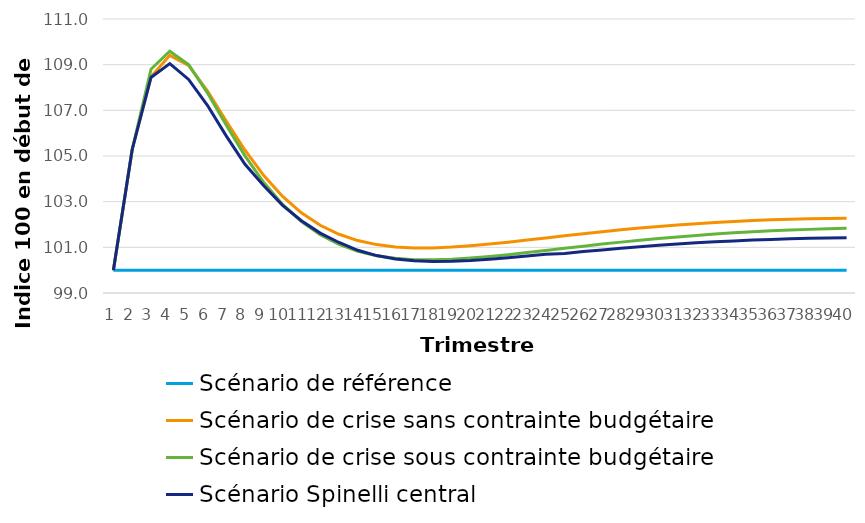
| Category | Scénario de référence | Scénario de crise sans contrainte budgétaire | Scénario de crise sous contrainte budgétaire | Scénario Spinelli central |
|---|---|---|---|---|
| 0 | 100 | 100 | 100 | 100 |
| 1 | 100 | 105.286 | 105.286 | 105.287 |
| 2 | 100 | 108.467 | 108.803 | 108.441 |
| 3 | 100 | 109.409 | 109.588 | 109.048 |
| 4 | 100 | 108.965 | 108.999 | 108.354 |
| 5 | 100 | 107.849 | 107.767 | 107.221 |
| 6 | 100 | 106.527 | 106.353 | 105.881 |
| 7 | 100 | 105.253 | 105.007 | 104.634 |
| 8 | 100 | 104.141 | 103.839 | 103.701 |
| 9 | 100 | 103.228 | 102.879 | 102.839 |
| 10 | 100 | 102.51 | 102.124 | 102.163 |
| 11 | 100 | 101.966 | 101.549 | 101.623 |
| 12 | 100 | 101.571 | 101.127 | 101.213 |
| 13 | 100 | 101.297 | 100.831 | 100.87 |
| 14 | 100 | 101.119 | 100.635 | 100.639 |
| 15 | 100 | 101.018 | 100.517 | 100.492 |
| 16 | 100 | 100.975 | 100.461 | 100.411 |
| 17 | 100 | 100.976 | 100.452 | 100.38 |
| 18 | 100 | 101.01 | 100.478 | 100.387 |
| 19 | 100 | 101.068 | 100.529 | 100.421 |
| 20 | 100 | 101.143 | 100.599 | 100.474 |
| 21 | 100 | 101.227 | 100.68 | 100.541 |
| 22 | 100 | 101.318 | 100.77 | 100.617 |
| 23 | 100 | 101.412 | 100.863 | 100.697 |
| 24 | 100 | 101.505 | 100.957 | 100.732 |
| 25 | 100 | 101.596 | 101.05 | 100.813 |
| 26 | 100 | 101.684 | 101.141 | 100.888 |
| 27 | 100 | 101.766 | 101.228 | 100.959 |
| 28 | 100 | 101.844 | 101.31 | 101.026 |
| 29 | 100 | 101.915 | 101.387 | 101.088 |
| 30 | 100 | 101.979 | 101.457 | 101.145 |
| 31 | 100 | 102.037 | 101.522 | 101.196 |
| 32 | 100 | 102.089 | 101.581 | 101.242 |
| 33 | 100 | 102.134 | 101.634 | 101.282 |
| 34 | 100 | 102.173 | 101.681 | 101.317 |
| 35 | 100 | 102.205 | 101.721 | 101.347 |
| 36 | 100 | 102.232 | 101.757 | 101.373 |
| 37 | 100 | 102.253 | 101.786 | 101.393 |
| 38 | 100 | 102.268 | 101.811 | 101.409 |
| 39 | 100 | 102.278 | 101.831 | 101.42 |